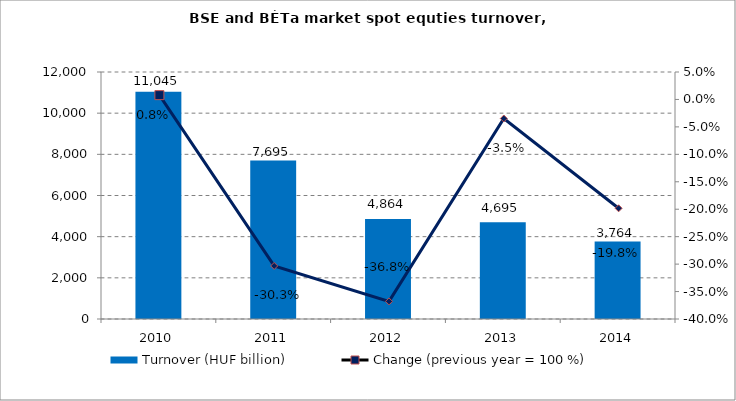
| Category | Turnover (HUF billion) |
|---|---|
| 2010.0 | 11045 |
| 2011.0 | 7695 |
| 2012.0 | 4864 |
| 2013.0 | 4695 |
| 2014.0 | 3764 |